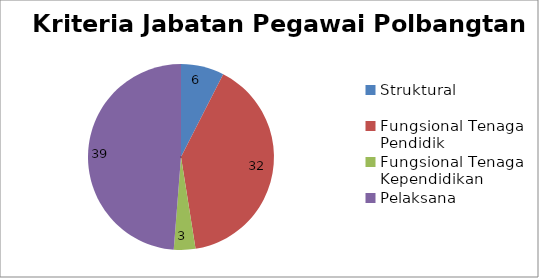
| Category | Jumlah |
|---|---|
| Struktural | 6 |
| Fungsional Tenaga Pendidik | 32 |
| Fungsional Tenaga Kependidikan | 3 |
| Pelaksana | 39 |